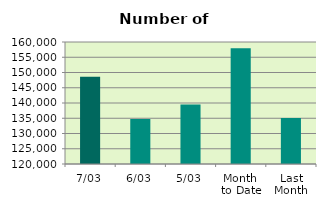
| Category | Series 0 |
|---|---|
| 7/03 | 148580 |
| 6/03 | 134754 |
| 5/03 | 139508 |
| Month 
to Date | 157975.6 |
| Last
Month | 135041.7 |